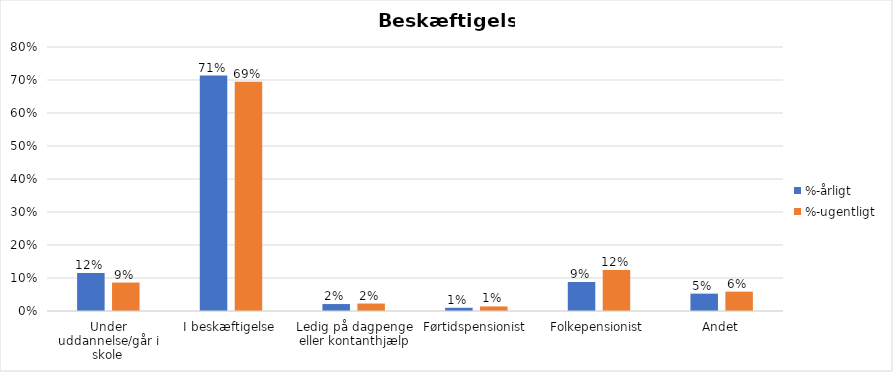
| Category | %-årligt | %-ugentligt |
|---|---|---|
| Under uddannelse/går i skole | 0.115 | 0.086 |
| I beskæftigelse | 0.713 | 0.695 |
| Ledig på dagpenge eller kontanthjælp | 0.021 | 0.023 |
| Førtidspensionist | 0.01 | 0.014 |
| Folkepensionist | 0.088 | 0.124 |
| Andet | 0.053 | 0.059 |